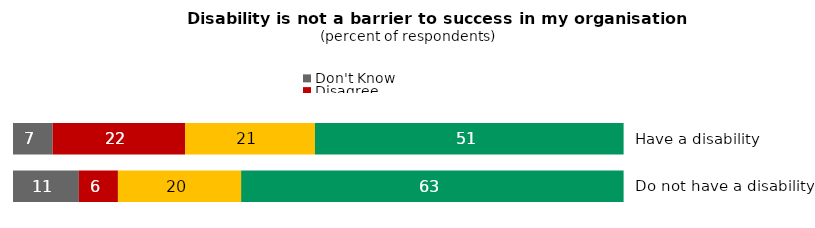
| Category | Don't Know | Disagree | Neither agree nor disagree | Agree |
|---|---|---|---|---|
| Have a disability | 6.5 | 21.7 | 21.3 | 50.6 |
| Do not have a disability | 10.8 | 6.4 | 20.2 | 62.7 |